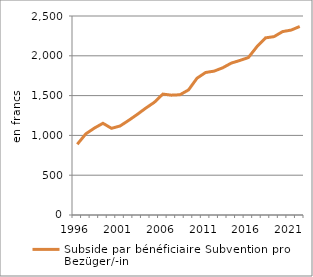
| Category | Subside par bénéficiaire |
|---|---|
| 1996.0 | 888.278 |
| 1997.0 | 1019.549 |
| 1998.0 | 1091.92 |
| 1999.0 | 1152.256 |
| 2000.0 | 1088.809 |
| 2001.0 | 1118.152 |
| 2002.0 | 1188.269 |
| 2003.0 | 1262.812 |
| 2004.0 | 1342.365 |
| 2005.0 | 1415.356 |
| 2006.0 | 1518.887 |
| 2007.0 | 1505.544 |
| 2008.0 | 1510.684 |
| 2009.0 | 1570.992 |
| 2010.0 | 1718.967 |
| 2011.0 | 1790.192 |
| 2012.0 | 1807.637 |
| 2013.0 | 1849.388 |
| 2014.0 | 1908.19 |
| 2015.0 | 1941.218 |
| 2016.0 | 1978.184 |
| 2017.0 | 2114.891 |
| 2018.0 | 2225.226 |
| 2019.0 | 2240.968 |
| 2020.0 | 2304.263 |
| 2021.0 | 2323.113 |
| 2022.0 | 2368.256 |